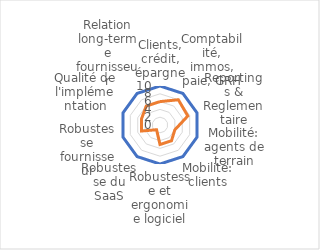
| Category | Ideal | Fournisseur #5 |
|---|---|---|
| Clients, crédit, épargne | 10 | 6 |
| Comptabilité, immos, paie, GRH | 10 | 8 |
| Reportings & Reglementaire | 10 | 7.5 |
| Mobilité: agents de terrain | 10 | 4 |
| Mobilité: clients | 10 | 5 |
| Robustesse et ergonomie logiciel | 10 | 5 |
| Robustesse du SaaS | 10 | 1.5 |
| Robustesse fournisseur | 10 | 5 |
| Qualité de l'implémentation | 10 | 5 |
| Relation long-terme fournisseur | 10 | 6 |